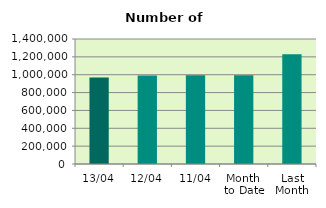
| Category | Series 0 |
|---|---|
| 13/04 | 969752 |
| 12/04 | 991986 |
| 11/04 | 993634 |
| Month 
to Date | 993766.286 |
| Last
Month | 1228285.652 |